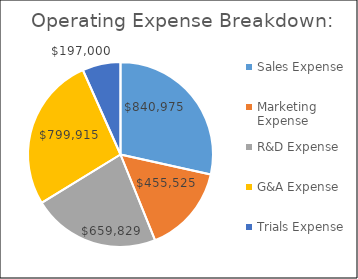
| Category | Series 0 |
|---|---|
| Sales Expense | 840975 |
| Marketing Expense | 455525 |
| R&D Expense | 659828.75 |
| G&A Expense | 799915 |
| Trials Expense | 197000 |